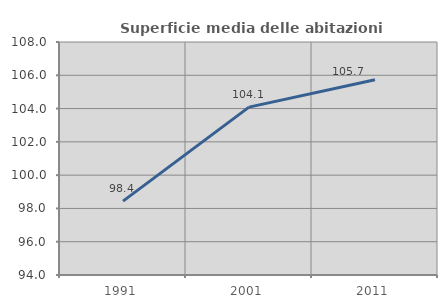
| Category | Superficie media delle abitazioni occupate |
|---|---|
| 1991.0 | 98.44 |
| 2001.0 | 104.088 |
| 2011.0 | 105.737 |